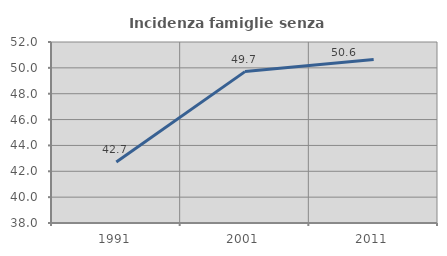
| Category | Incidenza famiglie senza nuclei |
|---|---|
| 1991.0 | 42.716 |
| 2001.0 | 49.71 |
| 2011.0 | 50.647 |